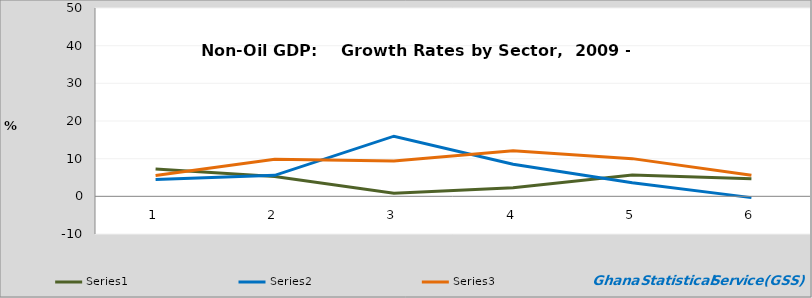
| Category | Series 0 | Series 1 | Series 2 |
|---|---|---|---|
| 0 | 7.226 | 4.486 | 5.55 |
| 1 | 5.277 | 5.58 | 9.819 |
| 2 | 0.846 | 15.969 | 9.377 |
| 3 | 2.302 | 8.539 | 12.083 |
| 4 | 5.678 | 3.624 | 10.008 |
| 5 | 4.649 | -0.341 | 5.573 |